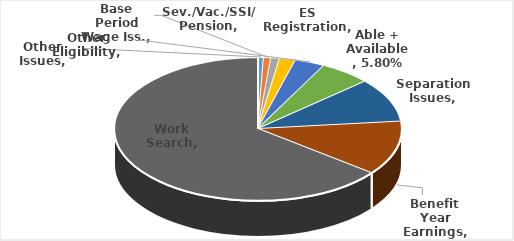
| Category | Series 0 |
|---|---|
| Other Issues | 0.007 |
| Base Period Wage Iss. | 0.008 |
| Sev./Vac./SSI/ Pension | 0.01 |
| ES Registration | 0.018 |
| Other Eligibility | 0.034 |
| Able + Available | 0.058 |
| Separation Issues | 0.099 |
| Benefit Year Earnings | 0.122 |
| Work Search | 0.645 |